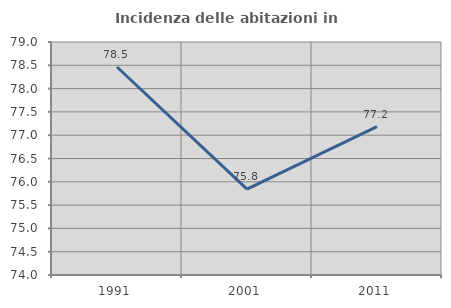
| Category | Incidenza delle abitazioni in proprietà  |
|---|---|
| 1991.0 | 78.463 |
| 2001.0 | 75.844 |
| 2011.0 | 77.182 |